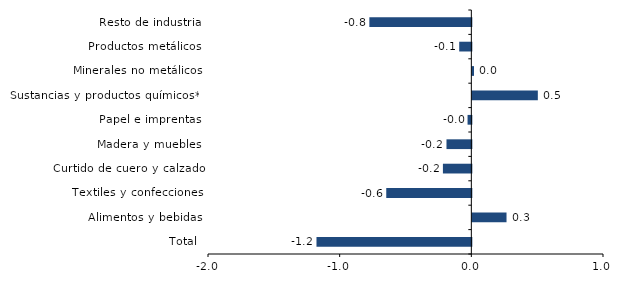
| Category | Series 0 |
|---|---|
| Total | -1.176 |
| Alimentos y bebidas | 0.26 |
| Textiles y confecciones | -0.646 |
| Curtido de cuero y calzado | -0.216 |
| Madera y muebles | -0.189 |
| Papel e imprentas | -0.029 |
| Sustancias y productos químicos** | 0.497 |
| Minerales no metálicos | 0.013 |
| Productos metálicos | -0.092 |
| Resto de industria | -0.774 |